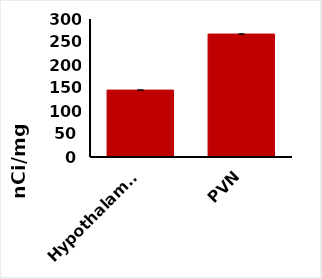
| Category | Specific Binding  |
|---|---|
| Hypothalamus | 145.45 |
| PVN | 267.28 |